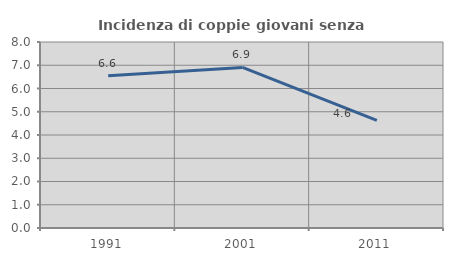
| Category | Incidenza di coppie giovani senza figli |
|---|---|
| 1991.0 | 6.55 |
| 2001.0 | 6.906 |
| 2011.0 | 4.626 |